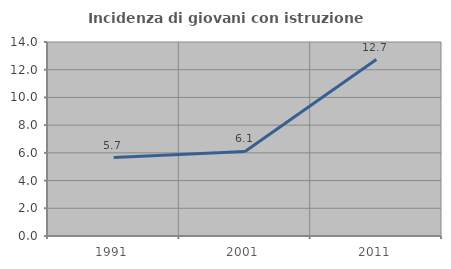
| Category | Incidenza di giovani con istruzione universitaria |
|---|---|
| 1991.0 | 5.657 |
| 2001.0 | 6.1 |
| 2011.0 | 12.732 |